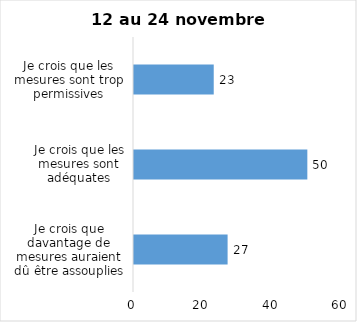
| Category | Series 0 |
|---|---|
| Je crois que davantage de mesures auraient dû être assouplies | 27 |
| Je crois que les mesures sont adéquates | 50 |
| Je crois que les mesures sont trop permissives | 23 |